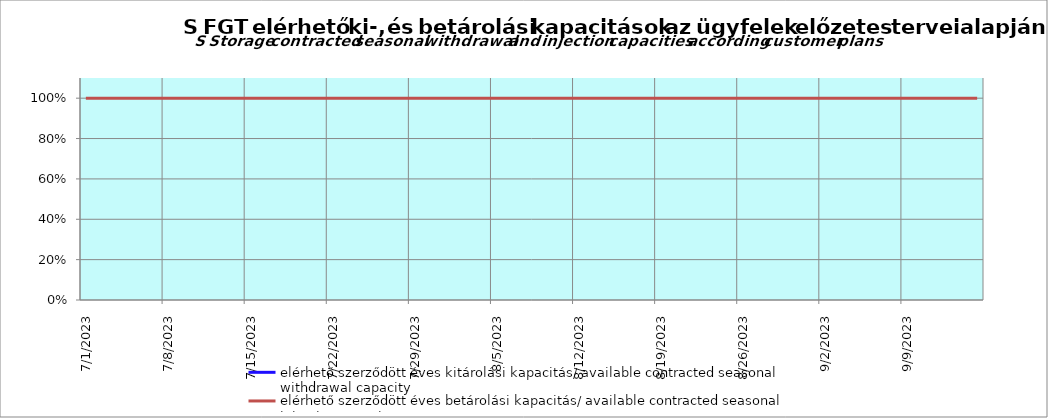
| Category | elérhető szerződött éves kitárolási kapacitás/ available contracted seasonal withdrawal capacity | elérhető szerződött éves betárolási kapacitás/ available contracted seasonal injection capacity |
|---|---|---|
| 7/1/23 |  | 1 |
| 7/2/23 |  | 1 |
| 7/3/23 |  | 1 |
| 7/4/23 |  | 1 |
| 7/5/23 |  | 1 |
| 7/6/23 |  | 1 |
| 7/7/23 |  | 1 |
| 7/8/23 |  | 1 |
| 7/9/23 |  | 1 |
| 7/10/23 |  | 1 |
| 7/11/23 |  | 1 |
| 7/12/23 |  | 1 |
| 7/13/23 |  | 1 |
| 7/14/23 |  | 1 |
| 7/15/23 |  | 1 |
| 7/16/23 |  | 1 |
| 7/17/23 |  | 1 |
| 7/18/23 |  | 1 |
| 7/19/23 |  | 1 |
| 7/20/23 |  | 1 |
| 7/21/23 |  | 1 |
| 7/22/23 |  | 1 |
| 7/23/23 |  | 1 |
| 7/24/23 |  | 1 |
| 7/25/23 |  | 1 |
| 7/26/23 |  | 1 |
| 7/27/23 |  | 1 |
| 7/28/23 |  | 1 |
| 7/29/23 |  | 1 |
| 7/30/23 |  | 1 |
| 7/31/23 |  | 1 |
| 8/1/23 |  | 1 |
| 8/2/23 |  | 1 |
| 8/3/23 |  | 1 |
| 8/4/23 |  | 1 |
| 8/5/23 |  | 1 |
| 8/6/23 |  | 1 |
| 8/7/23 |  | 1 |
| 8/8/23 |  | 1 |
| 8/9/23 |  | 1 |
| 8/10/23 |  | 1 |
| 8/11/23 |  | 1 |
| 8/12/23 |  | 1 |
| 8/13/23 |  | 1 |
| 8/14/23 |  | 1 |
| 8/15/23 |  | 1 |
| 8/16/23 |  | 1 |
| 8/17/23 |  | 1 |
| 8/18/23 |  | 1 |
| 8/19/23 |  | 1 |
| 8/20/23 |  | 1 |
| 8/21/23 |  | 1 |
| 8/22/23 |  | 1 |
| 8/23/23 |  | 1 |
| 8/24/23 |  | 1 |
| 8/25/23 |  | 1 |
| 8/26/23 |  | 1 |
| 8/27/23 |  | 1 |
| 8/28/23 |  | 1 |
| 8/29/23 |  | 1 |
| 8/30/23 |  | 1 |
| 8/31/23 |  | 1 |
| 9/1/23 |  | 1 |
| 9/2/23 |  | 1 |
| 9/3/23 |  | 1 |
| 9/4/23 |  | 1 |
| 9/5/23 |  | 1 |
| 9/6/23 |  | 1 |
| 9/7/23 |  | 1 |
| 9/8/23 |  | 1 |
| 9/9/23 |  | 1 |
| 9/10/23 |  | 1 |
| 9/11/23 |  | 1 |
| 9/12/23 |  | 1 |
| 9/13/23 |  | 1 |
| 9/14/23 |  | 1 |
| 9/15/23 |  | 1 |